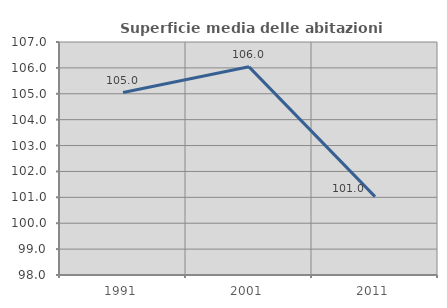
| Category | Superficie media delle abitazioni occupate |
|---|---|
| 1991.0 | 105.048 |
| 2001.0 | 106.04 |
| 2011.0 | 101.029 |